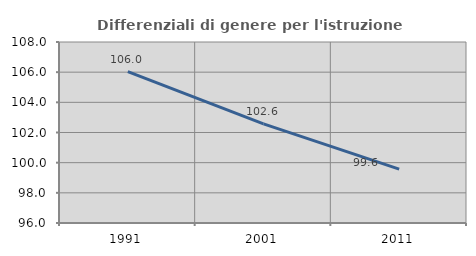
| Category | Differenziali di genere per l'istruzione superiore |
|---|---|
| 1991.0 | 106.034 |
| 2001.0 | 102.568 |
| 2011.0 | 99.568 |